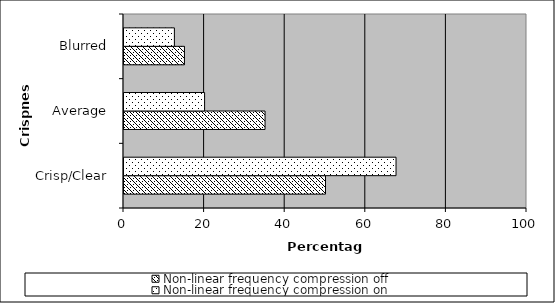
| Category | Non-linear frequency compression off | Non-linear frequency compression on |
|---|---|---|
| Crisp/Clear | 50 | 67.5 |
| Average | 35 | 20 |
| Blurred | 15 | 12.5 |